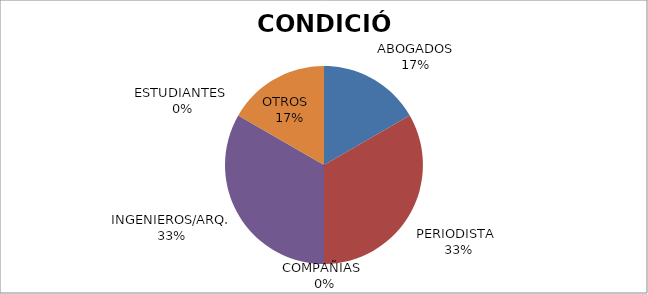
| Category | Series 0 |
|---|---|
| ABOGADOS | 1 |
| PERIODISTA  | 2 |
| COMPAÑIAS  | 0 |
| INGENIEROS/ARQ. | 2 |
| ESTUDIANTES  | 0 |
| OTROS   | 1 |